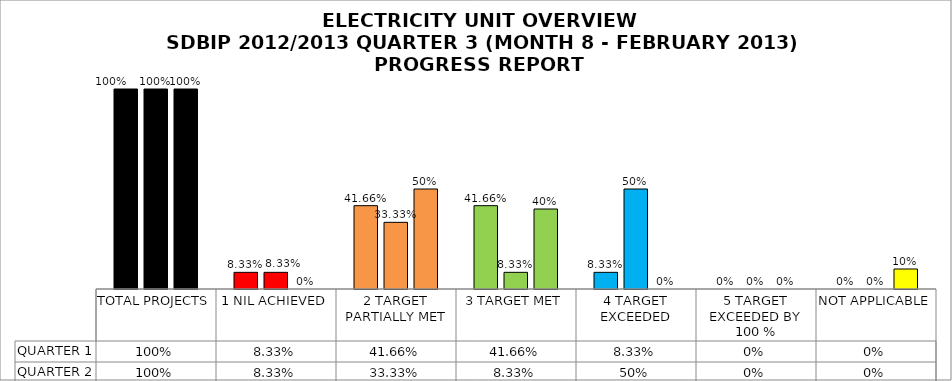
| Category | QUARTER 1 | QUARTER 2 | QUARTER 3 |
|---|---|---|---|
| TOTAL PROJECTS | 1 | 1 | 1 |
| 1 NIL ACHIEVED | 0.083 | 0.083 | 0 |
| 2 TARGET PARTIALLY MET | 0.417 | 0.333 | 0.5 |
| 3 TARGET MET | 0.417 | 0.083 | 0.4 |
| 4 TARGET EXCEEDED | 0.083 | 0.5 | 0 |
| 5 TARGET EXCEEDED BY 100 % | 0 | 0 | 0 |
| NOT APPLICABLE | 0 | 0 | 0.1 |